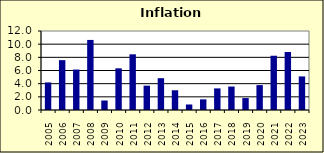
| Category | 27.5 |
|---|---|
| 2005.0 | 4.19 |
| 2006.0 | 7.573 |
| 2007.0 | 6.144 |
| 2008.0 | 10.644 |
| 2009.0 | 1.442 |
| 2010.0 | 6.33 |
| 2011.0 | 8.459 |
| 2012.0 | 3.694 |
| 2013.0 | 4.831 |
| 2014.0 | 2.999 |
| 2015.0 | 0.837 |
| 2016.0 | 1.614 |
| 2017.0 | 3.28 |
| 2018.0 | 3.564 |
| 2019.0 | 1.811 |
| 2020.0 | 3.781 |
| 2021.0 | 8.243 |
| 2022.0 | 8.812 |
| 2023.0 | 5.1 |